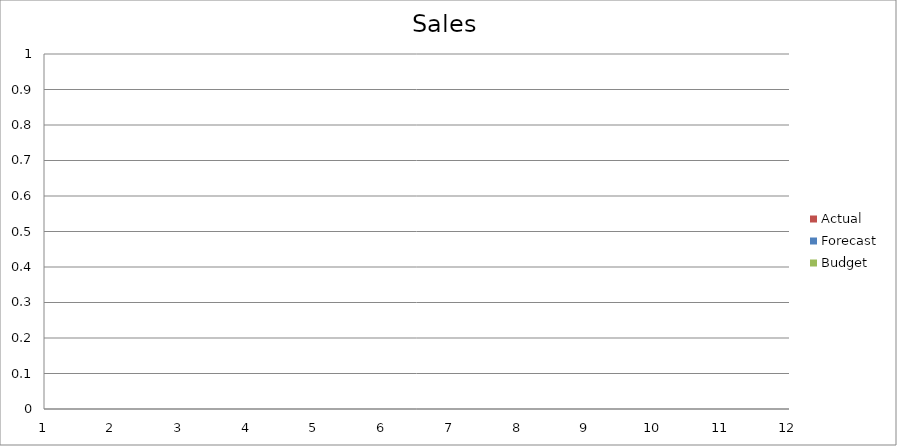
| Category | Budget | Forecast | Actual |
|---|---|---|---|
| 0 | 760 | 3300 | 1740 |
| 1 | 1080 | 1150 | 2120 |
| 2 | 1980 | 2550 | 1770 |
| 3 | 2590 | 770 | 2970 |
| 4 | 2260 | 1650 | 1500 |
| 5 | 810 | 2910 | 590 |
| 6 | 3240 | 2160 | 2710 |
| 7 | 670 | 2640 | 2100 |
| 8 | 2990 | 1580 | 990 |
| 9 | 2820 | 2640 | 1930 |
| 10 | 1100 | 2830 | 3020 |
| 11 | 610 | 3180 | 700 |